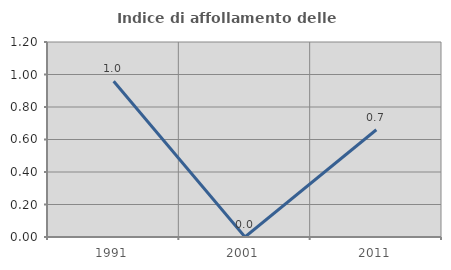
| Category | Indice di affollamento delle abitazioni  |
|---|---|
| 1991.0 | 0.958 |
| 2001.0 | 0 |
| 2011.0 | 0.66 |